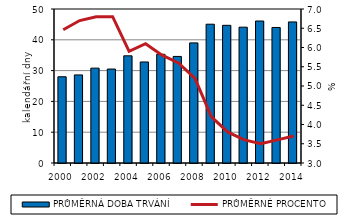
| Category | PRŮMĚRNÁ DOBA TRVÁNÍ |
|---|---|
| 2000.0 | 28 |
| 2001.0 | 28.6 |
| 2002.0 | 30.8 |
| 2003.0 | 30.5 |
| 2004.0 | 34.8 |
| 2005.0 | 32.8 |
| 2006.0 | 35.3 |
| 2007.0 | 34.6 |
| 2008.0 | 39 |
| 2009.0 | 45.06 |
| 2010.0 | 44.7 |
| 2011.0 | 44.1 |
| 2012.0 | 46.1 |
| 2013.0 | 44 |
| 2014.0 | 45.8 |